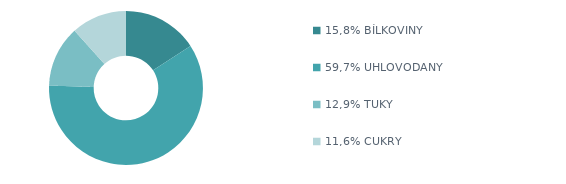
| Category | Series 0 |
|---|---|
| 15,8% BÍLKOVINY | 915 |
| 59,7% UHLOVODANY | 3460 |
| 12,9% TUKY | 745 |
| 11,6% CUKRY | 675 |